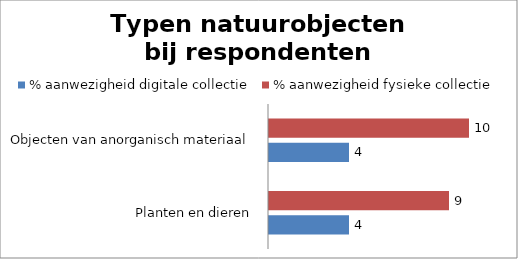
| Category | % aanwezigheid digitale collectie | % aanwezigheid fysieke collectie |
|---|---|---|
| Planten en dieren | 4 | 9 |
| Objecten van anorganisch materiaal | 4 | 10 |